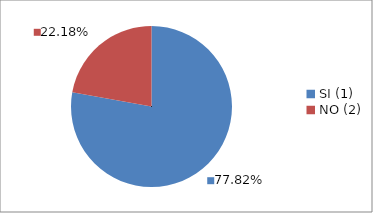
| Category | Series 0 |
|---|---|
| SI (1) | 0.778 |
| NO (2) | 0.222 |